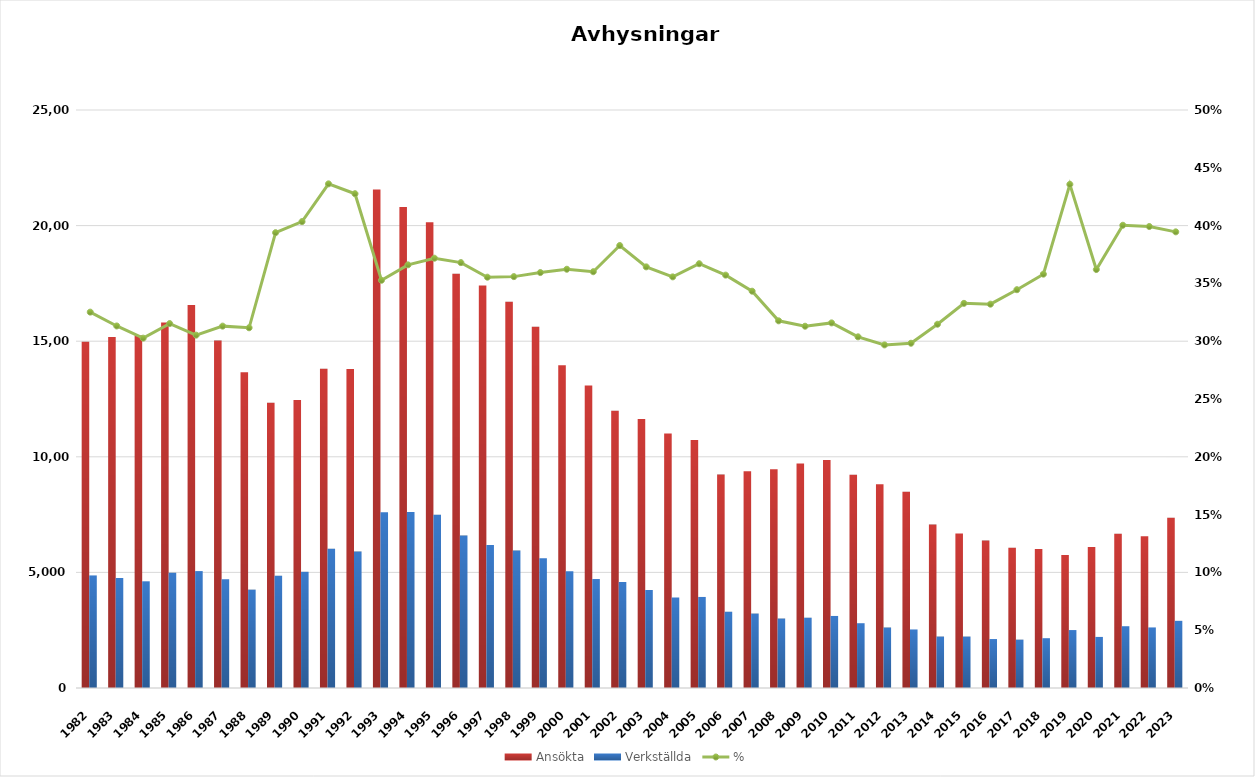
| Category | Ansökta | Verkställda |
|---|---|---|
| 1982.0 | 14975 | 4869 |
| 1983.0 | 15180 | 4754 |
| 1984.0 | 15249 | 4615 |
| 1985.0 | 15813 | 4985 |
| 1986.0 | 16567 | 5057 |
| 1987.0 | 15027 | 4704 |
| 1988.0 | 13652 | 4254 |
| 1989.0 | 12334 | 4858 |
| 1990.0 | 12458 | 5026 |
| 1991.0 | 13806 | 6021 |
| 1992.0 | 13797 | 5899 |
| 1993.0 | 21566 | 7606 |
| 1994.0 | 20803 | 7615 |
| 1995.0 | 20146 | 7490 |
| 1996.0 | 17914 | 6592 |
| 1997.0 | 17410 | 6187 |
| 1998.0 | 16706 | 5945 |
| 1999.0 | 15622 | 5614 |
| 2000.0 | 13955 | 5055 |
| 2001.0 | 13088 | 4713 |
| 2002.0 | 11992 | 4590 |
| 2003.0 | 11636 | 4239 |
| 2004.0 | 11008 | 3915 |
| 2005.0 | 10730 | 3938 |
| 2006.0 | 9234 | 3298 |
| 2007.0 | 9378 | 3219 |
| 2008.0 | 9458 | 3004 |
| 2009.0 | 9714 | 3040 |
| 2010.0 | 9866 | 3116 |
| 2011.0 | 9224 | 2802 |
| 2012.0 | 8814 | 2616 |
| 2013.0 | 8490 | 2532 |
| 2014.0 | 7071 | 2225 |
| 2015.0 | 6684 | 2224 |
| 2016.0 | 6376 | 2117 |
| 2017.0 | 6069 | 2091 |
| 2018.0 | 6017 | 2154 |
| 2019.0 | 5752 | 2506 |
| 2020.0 | 6102 | 2209 |
| 2021.0 | 6675 | 2672 |
| 2022.0 | 6563 | 2620 |
| 2023.0 | 7362 | 2905 |